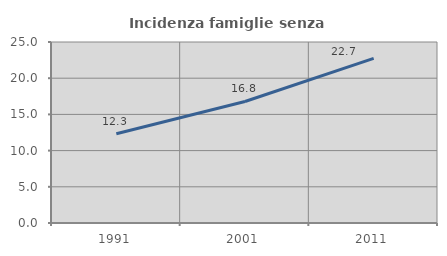
| Category | Incidenza famiglie senza nuclei |
|---|---|
| 1991.0 | 12.334 |
| 2001.0 | 16.782 |
| 2011.0 | 22.73 |